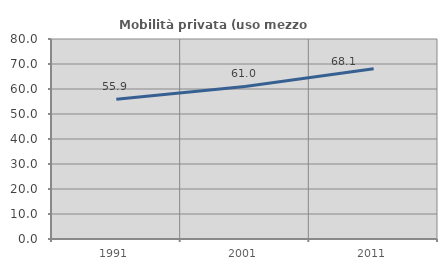
| Category | Mobilità privata (uso mezzo privato) |
|---|---|
| 1991.0 | 55.882 |
| 2001.0 | 61.039 |
| 2011.0 | 68.103 |